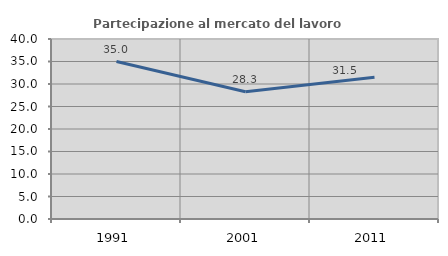
| Category | Partecipazione al mercato del lavoro  femminile |
|---|---|
| 1991.0 | 34.99 |
| 2001.0 | 28.274 |
| 2011.0 | 31.486 |